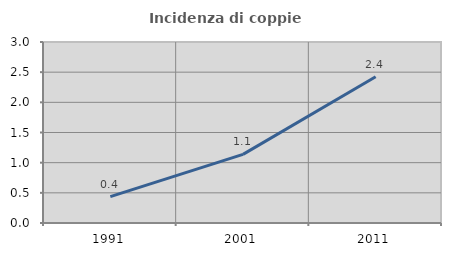
| Category | Incidenza di coppie miste |
|---|---|
| 1991.0 | 0.436 |
| 2001.0 | 1.138 |
| 2011.0 | 2.425 |